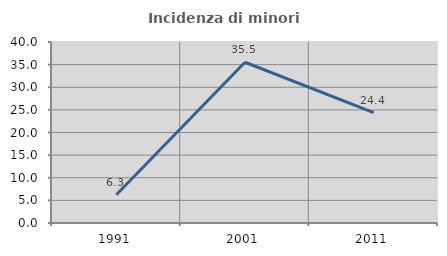
| Category | Incidenza di minori stranieri |
|---|---|
| 1991.0 | 6.25 |
| 2001.0 | 35.526 |
| 2011.0 | 24.39 |